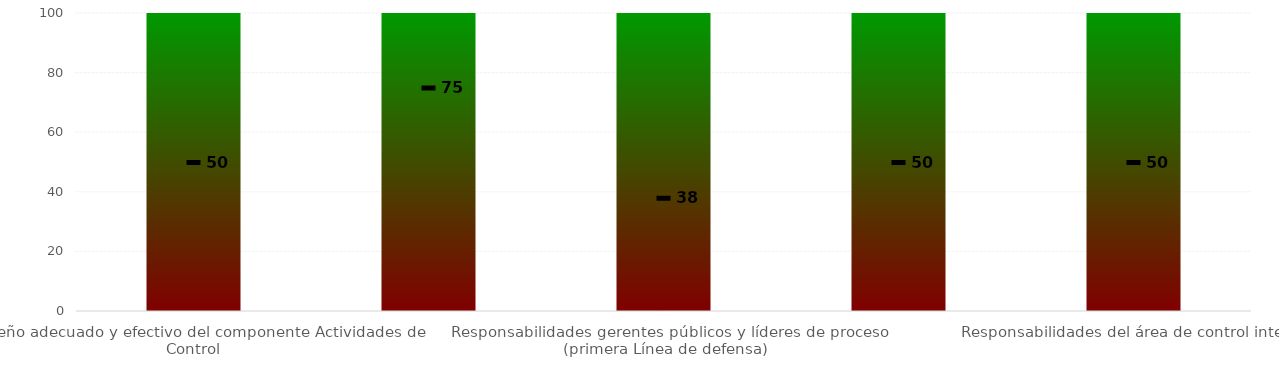
| Category | Niveles |
|---|---|
| Diseño adecuado y efectivo del componente Actividades de Control | 100 |
| Responsabilidades de la Alta dirección y Comité Institucional de Coordinación de Control Interno (línea estratégica) | 100 |
| Responsabilidades gerentes públicos y líderes de proceso (primera Línea de defensa) | 100 |
| Responsabilidades de los servidores encargados del monitoreo y evaluación de controles y gestión del riesgo (segunda línea de defensa) | 100 |
| Responsabilidades del área de control interno | 100 |